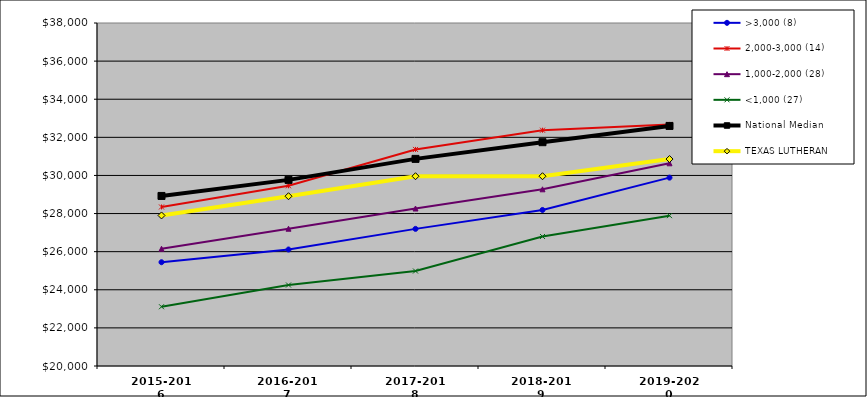
| Category | >3,000 (8) | 2,000-3,000 (14) | 1,000-2,000 (28) | <1,000 (27) | National Median | TEXAS LUTHERAN |
|---|---|---|---|---|---|---|
| 2015-2016 | 25446 | 28345 | 26152.5 | 23110 | 28924.5 | 27900 |
| 2016-2017 | 26113 | 29457 | 27205 | 24250 | 29767 | 28910 |
| 2017-2018 | 27196 | 31365 | 28265 | 24985 | 30869 | 29960 |
| 2018-2019 | 28189 | 32375 | 29273 | 26796 | 31745 | 29960 |
| 2019-2020 | 29885 | 32678 | 30637.5 | 27890 | 32598 | 30860 |